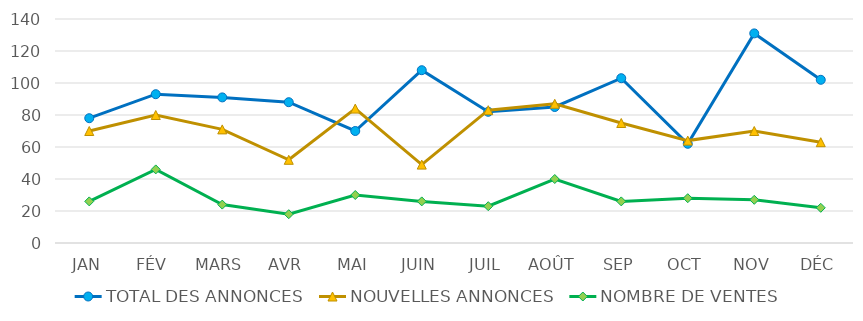
| Category | TOTAL DES ANNONCES | NOUVELLES ANNONCES | NOMBRE DE VENTES |
|---|---|---|---|
| JAN | 78 | 70 | 26 |
| FÉV | 93 | 80 | 46 |
| MARS | 91 | 71 | 24 |
| AVR | 88 | 52 | 18 |
| MAI | 70 | 84 | 30 |
| JUIN | 108 | 49 | 26 |
| JUIL | 82 | 83 | 23 |
| AOÛT | 85 | 87 | 40 |
| SEP | 103 | 75 | 26 |
| OCT | 62 | 64 | 28 |
| NOV | 131 | 70 | 27 |
| DÉC | 102 | 63 | 22 |